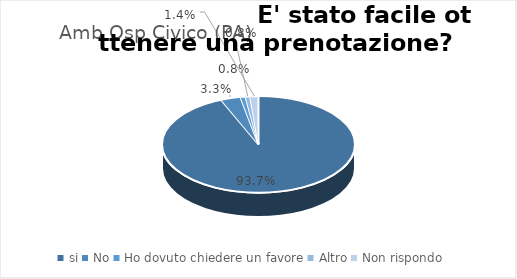
| Category | Amb Osp Civico (PA) |
|---|---|
| si | 0.937 |
| No | 0.033 |
| Ho dovuto chiedere un favore | 0.008 |
| Altro | 0.008 |
| Non rispondo | 0.014 |